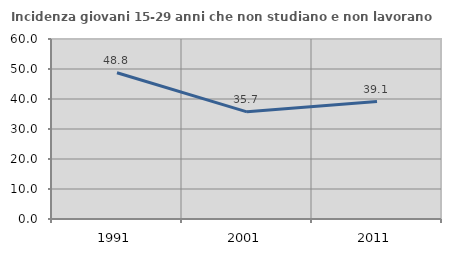
| Category | Incidenza giovani 15-29 anni che non studiano e non lavorano  |
|---|---|
| 1991.0 | 48.77 |
| 2001.0 | 35.714 |
| 2011.0 | 39.13 |